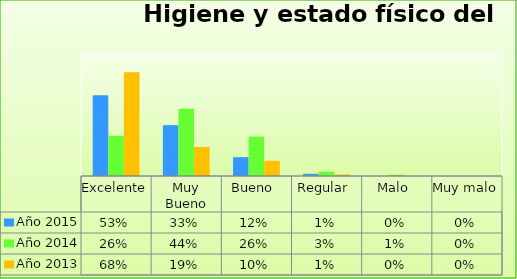
| Category | Año 2015 | Año 2014 | Año 2013 |
|---|---|---|---|
| Excelente | 0.529 | 0.264 | 0.68 |
| Muy Bueno | 0.333 | 0.441 | 0.19 |
| Bueno  | 0.124 | 0.258 | 0.1 |
| Regular  | 0.014 | 0.029 | 0.01 |
| Malo  | 0 | 0.008 | 0 |
| Muy malo  | 0 | 0 | 0 |